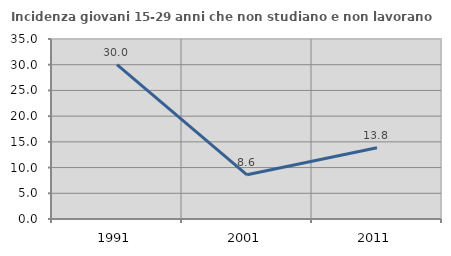
| Category | Incidenza giovani 15-29 anni che non studiano e non lavorano  |
|---|---|
| 1991.0 | 30 |
| 2001.0 | 8.596 |
| 2011.0 | 13.838 |